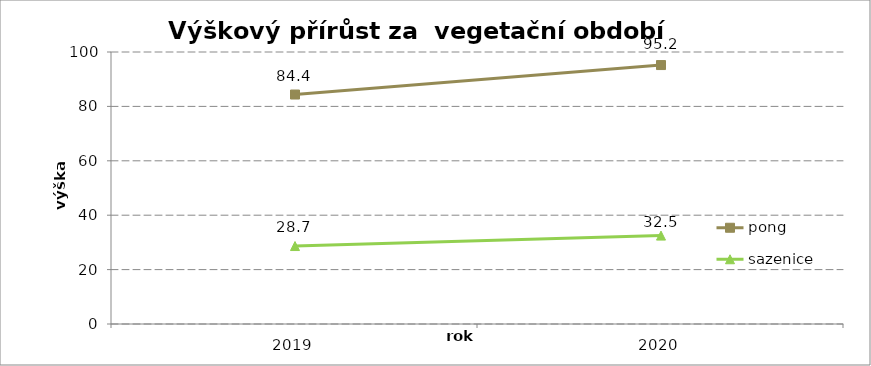
| Category | pong | sazenice |
|---|---|---|
| 2019.0 | 84.365 | 28.664 |
| 2020.0 | 95.2 | 32.5 |